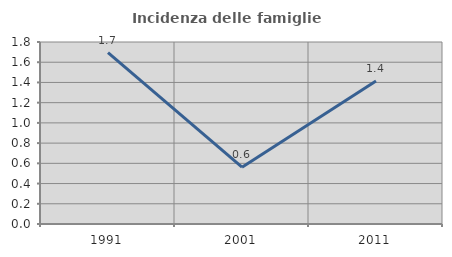
| Category | Incidenza delle famiglie numerose |
|---|---|
| 1991.0 | 1.695 |
| 2001.0 | 0.562 |
| 2011.0 | 1.415 |